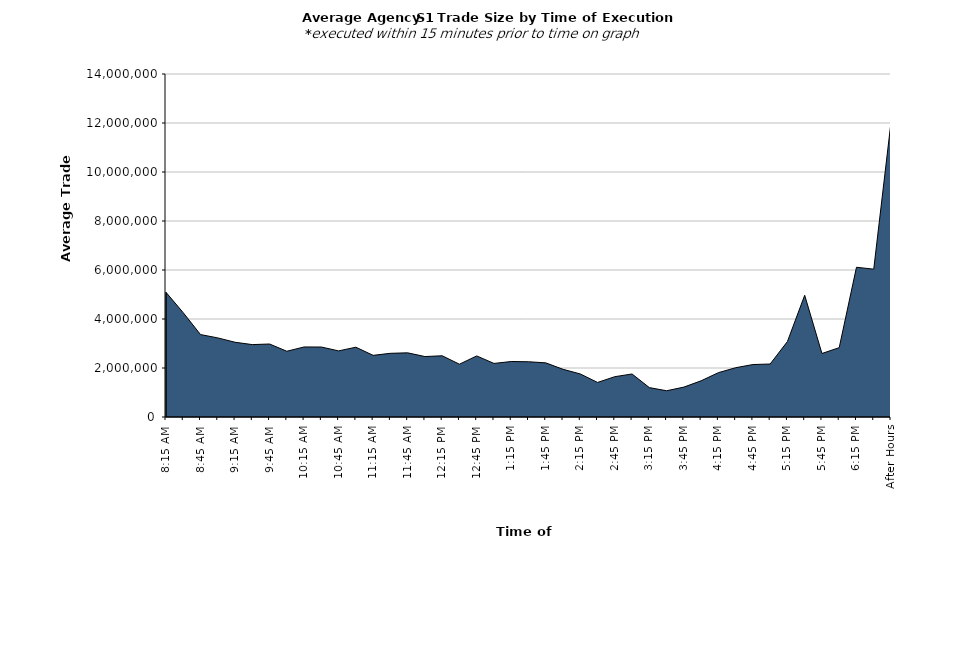
| Category | Series 0 |
|---|---|
| 8:15 AM | 5088803.908 |
| 8:30 AM | 4255928.157 |
| 8:45 AM | 3364608.146 |
| 9:00 AM | 3228418.513 |
| 9:15 AM | 3050611.28 |
| 9:30 AM | 2955264.115 |
| 9:45 AM | 2979473.2 |
| 10:00 AM | 2684110.904 |
| 10:15 AM | 2858667.883 |
| 10:30 AM | 2856120.232 |
| 10:45 AM | 2698967.706 |
| 11:00 AM | 2849046.96 |
| 11:15 AM | 2516299.573 |
| 11:30 AM | 2598950.624 |
| 11:45 AM | 2618765.1 |
| 12:00 PM | 2466884.714 |
| 12:15 PM | 2498172.435 |
| 12:30 PM | 2155274.89 |
| 12:45 PM | 2493150.922 |
| 1:00 PM | 2186226.427 |
| 1:15 PM | 2265245.178 |
| 1:30 PM | 2254616.068 |
| 1:45 PM | 2210434.138 |
| 2:00 PM | 1946915.336 |
| 2:15 PM | 1757061.212 |
| 2:30 PM | 1411297.447 |
| 2:45 PM | 1645921.617 |
| 3:00 PM | 1755522.231 |
| 3:15 PM | 1200247.248 |
| 3:30 PM | 1071118.682 |
| 3:45 PM | 1219449.708 |
| 4:00 PM | 1477916.28 |
| 4:15 PM | 1810010.377 |
| 4:30 PM | 2011214.139 |
| 4:45 PM | 2141210.519 |
| 5:00 PM | 2163112.965 |
| 5:15 PM | 3080308.329 |
| 5:30 PM | 4968203.366 |
| 5:45 PM | 2592004.115 |
| 6:00 PM | 2830600.275 |
| 6:15 PM | 6111005.448 |
| 6:30 PM | 6035000 |
| After Hours | 12037267.135 |